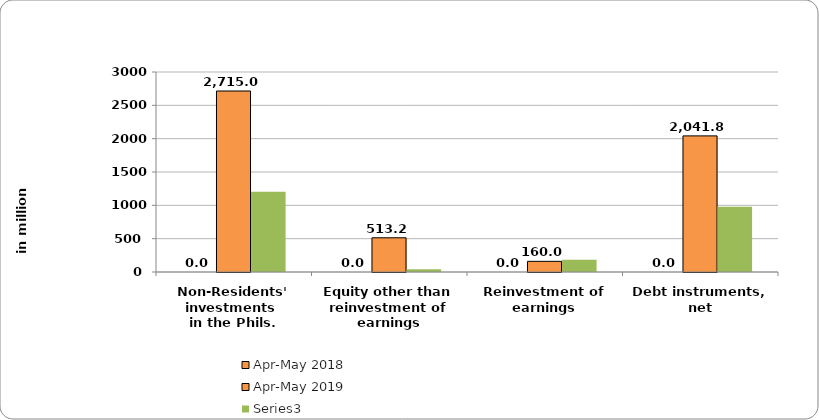
| Category | Apr-May 2018 | Apr-May 2019 | Series 2 |
|---|---|---|---|
| Non-Residents' investments 
in the Phils. |  | 2714.967 | 1203.932 |
| Equity other than reinvestment of earnings |  | 513.165 | 40.431 |
| Reinvestment of earnings |  | 160.036 | 184.012 |
| Debt instruments, net |  | 2041.766 | 979.489 |